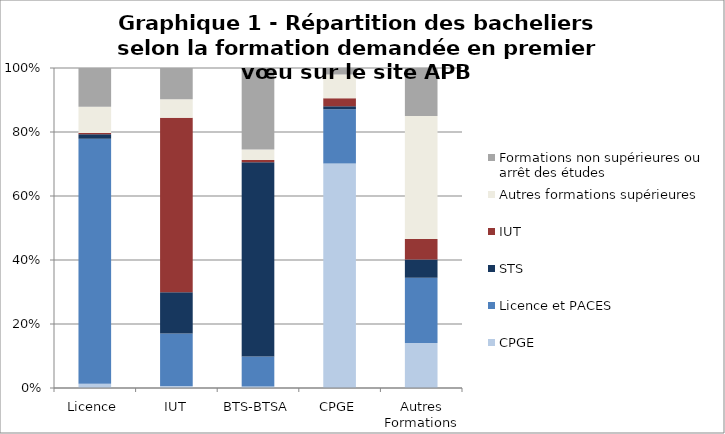
| Category | CPGE | Licence et PACES | STS | IUT | Autres formations supérieures | Formations non supérieures ou arrêt des études |
|---|---|---|---|---|---|---|
| Licence | 1.29 | 76.62 | 1.36 | 0.39 | 8.24 | 12.1 |
| IUT | 0.63 | 16.41 | 12.89 | 54.55 | 5.75 | 9.76 |
| BTS-BTSA | 0.45 | 9.38 | 60.71 | 0.69 | 3.27 | 25.51 |
| CPGE | 70.12 | 16.98 | 0.98 | 2.45 | 7.45 | 2.02 |
| Autres Formations | 14.08 | 20.41 | 5.65 | 6.43 | 38.44 | 14.99 |